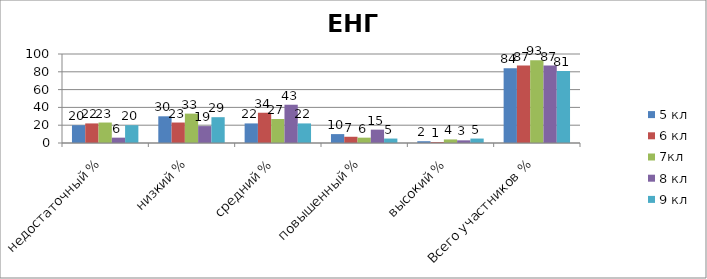
| Category | 5 кл | 6 кл | 7кл | 8 кл | 9 кл |
|---|---|---|---|---|---|
| недостаточный % | 20 | 22 | 23 | 6 | 20 |
| низкий % | 30 | 23 | 33 | 19 | 29 |
| средний % | 22 | 34 | 27 | 43 | 22 |
| повышенный % | 10 | 7 | 6 | 15 | 5 |
| высокий % | 2 | 1 | 4 | 3 | 5 |
| Всего участников % | 84 | 87 | 93 | 87 | 81 |